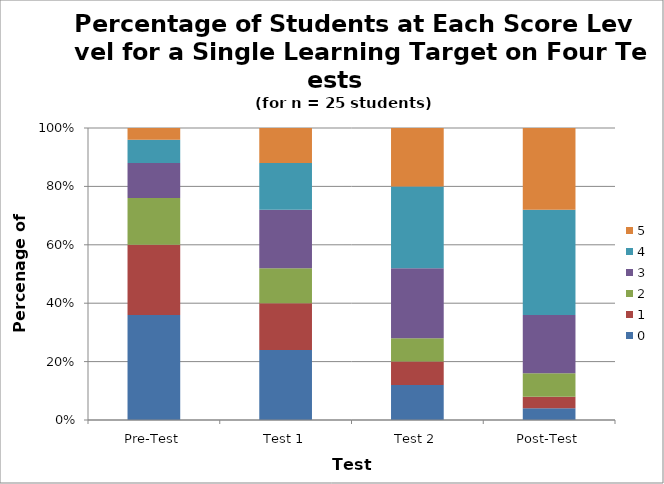
| Category | 0 | 1 | 2 | 3 | 4 | 5 |
|---|---|---|---|---|---|---|
| Pre-Test | 9 | 6 | 4 | 3 | 2 | 1 |
| Test 1 | 6 | 4 | 3 | 5 | 4 | 3 |
| Test 2 | 3 | 2 | 2 | 6 | 7 | 5 |
| Post-Test | 1 | 1 | 2 | 5 | 9 | 7 |